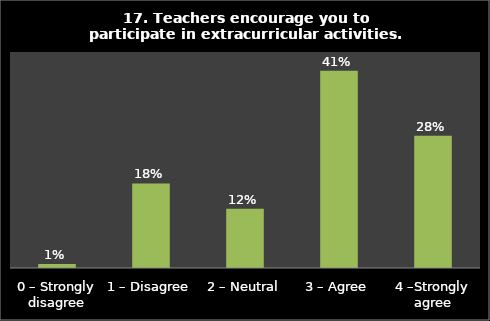
| Category | Series 0 |
|---|---|
| 0 – Strongly disagree | 0.008 |
| 1 – Disagree | 0.176 |
| 2 – Neutral | 0.123 |
| 3 – Agree | 0.411 |
| 4 –Strongly agree | 0.276 |